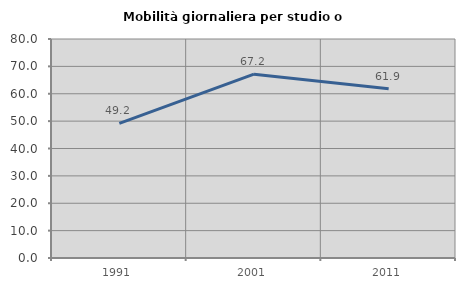
| Category | Mobilità giornaliera per studio o lavoro |
|---|---|
| 1991.0 | 49.187 |
| 2001.0 | 67.153 |
| 2011.0 | 61.862 |